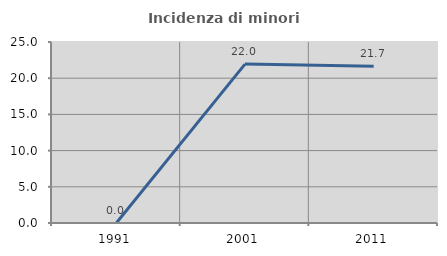
| Category | Incidenza di minori stranieri |
|---|---|
| 1991.0 | 0 |
| 2001.0 | 21.951 |
| 2011.0 | 21.661 |